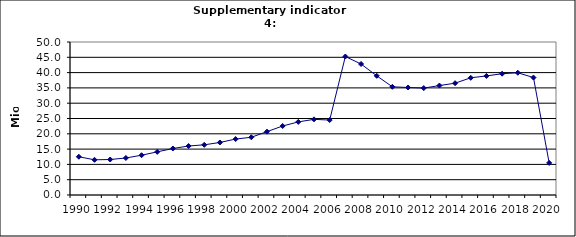
| Category | Domestic air-passengers, Mio |
|---|---|
| 1990 | 12.5 |
| 1991 | 11.5 |
| 1992 | 11.6 |
| 1993 | 12.1 |
| 1994 | 13 |
| 1995 | 14.1 |
| 1996 | 15.2 |
| 1997 | 16.013 |
| 1998 | 16.4 |
| 1999 | 17.17 |
| 2000 | 18.283 |
| 2001 | 18.867 |
| 2002 | 20.696 |
| 2003 | 22.553 |
| 2004 | 23.89 |
| 2005 | 24.719 |
| 2006 | 24.491 |
| 2007 | 45.256 |
| 2008 | 42.812 |
| 2009 | 38.953 |
| 2010 | 35.351 |
| 2011 | 35.132 |
| 2012 | 34.935 |
| 2013 | 35.761 |
| 2014 | 36.543 |
| 2015 | 38.307 |
| 2016 | 38.904 |
| 2017 | 39.637 |
| 2018 | 39.951 |
| 2019 | 38.381 |
| 2020 | 10.487 |